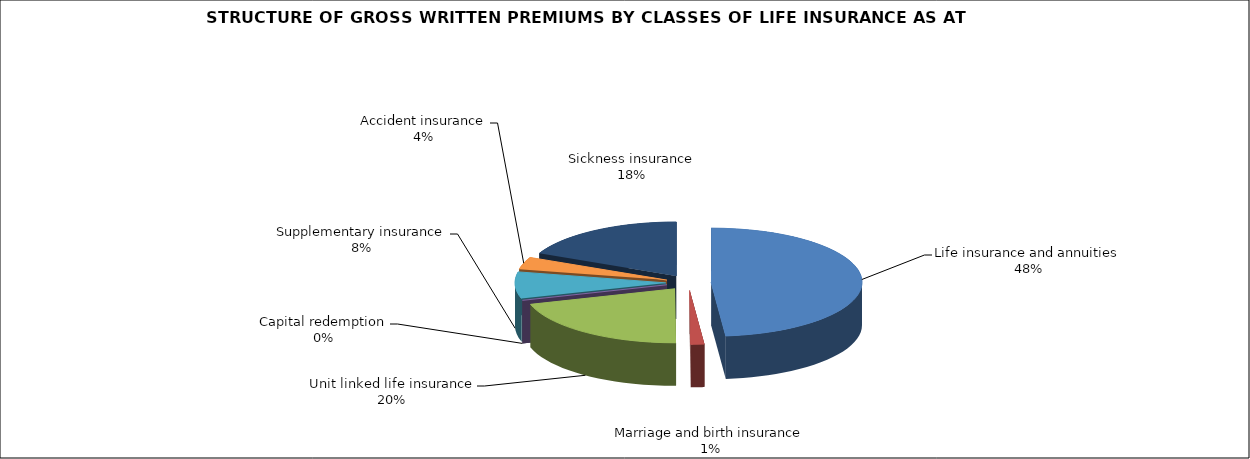
| Category | Life insurance and annuities |
|---|---|
| Life insurance and annuities | 0.484 |
| Marriage and birth insurance | 0.014 |
| Unit linked life insurance | 0.204 |
| Capital redemption | 0 |
| Supplementary insurance | 0.079 |
| Accident insurance | 0.036 |
| Sickness insurance | 0.181 |